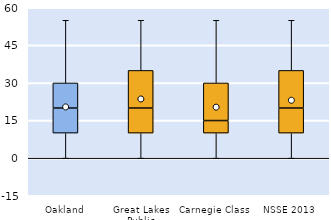
| Category | 25th | 50th | 75th |
|---|---|---|---|
| Oakland | 10 | 10 | 10 |
| Great Lakes Public | 10 | 10 | 15 |
| Carnegie Class | 10 | 5 | 15 |
| NSSE 2013 | 10 | 10 | 15 |